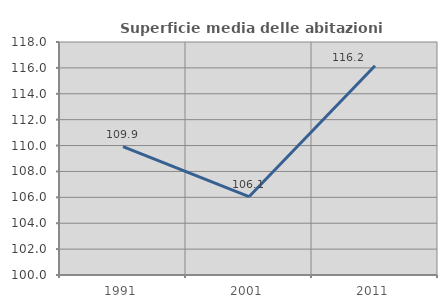
| Category | Superficie media delle abitazioni occupate |
|---|---|
| 1991.0 | 109.916 |
| 2001.0 | 106.051 |
| 2011.0 | 116.159 |